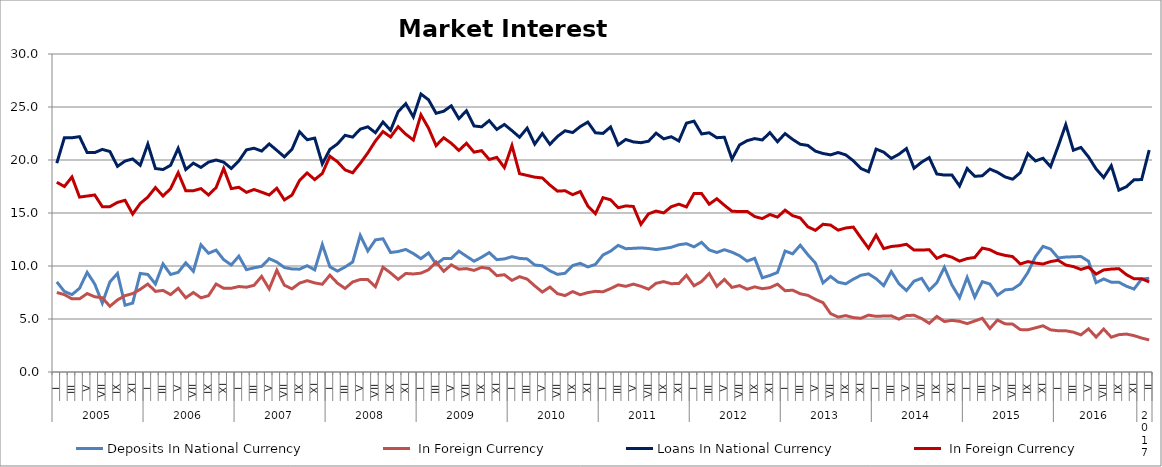
| Category | Deposits | Loans |
|---|---|---|
| 0 | 7.5 | 17.9 |
| 1 | 7.3 | 17.5 |
| 2 | 6.9 | 18.4 |
| 3 | 6.9 | 16.5 |
| 4 | 7.4 | 16.6 |
| 5 | 7.1 | 16.7 |
| 6 | 7 | 15.6 |
| 7 | 6.2 | 15.6 |
| 8 | 6.8 | 16 |
| 9 | 7.2 | 16.2 |
| 10 | 7.4 | 14.9 |
| 11 | 7.8 | 15.9 |
| 12 | 8.3 | 16.5 |
| 13 | 7.6 | 17.4 |
| 14 | 7.7 | 16.6 |
| 15 | 7.3 | 17.3 |
| 16 | 7.9 | 18.8 |
| 17 | 7 | 17.1 |
| 18 | 7.5 | 17.1 |
| 19 | 7 | 17.3 |
| 20 | 7.2 | 16.7 |
| 21 | 8.3 | 17.4 |
| 22 | 7.9 | 19.2 |
| 23 | 7.9 | 17.3 |
| 24 | 8.065 | 17.427 |
| 25 | 8 | 16.948 |
| 26 | 8.178 | 17.216 |
| 27 | 9.017 | 16.966 |
| 28 | 7.838 | 16.698 |
| 29 | 9.598 | 17.334 |
| 30 | 8.187 | 16.239 |
| 31 | 7.847 | 16.691 |
| 32 | 8.383 | 18.071 |
| 33 | 8.618 | 18.776 |
| 34 | 8.405 | 18.149 |
| 35 | 8.277 | 18.735 |
| 36 | 9.137 | 20.354 |
| 37 | 8.38 | 19.831 |
| 38 | 7.883 | 19.065 |
| 39 | 8.496 | 18.793 |
| 40 | 8.724 | 19.686 |
| 41 | 8.718 | 20.674 |
| 42 | 8.041 | 21.792 |
| 43 | 9.883 | 22.683 |
| 44 | 9.345 | 22.171 |
| 45 | 8.74 | 23.151 |
| 46 | 9.296 | 22.44 |
| 47 | 9.249 | 21.881 |
| 48 | 9.327 | 24.264 |
| 49 | 9.643 | 23.008 |
| 50 | 10.375 | 21.357 |
| 51 | 9.5 | 22.1 |
| 52 | 10.112 | 21.579 |
| 53 | 9.7 | 20.9 |
| 54 | 9.755 | 21.577 |
| 55 | 9.586 | 20.738 |
| 56 | 9.871 | 20.882 |
| 57 | 9.763 | 20.05 |
| 58 | 9.091 | 20.248 |
| 59 | 9.175 | 19.284 |
| 60 | 8.643 | 21.363 |
| 61 | 8.997 | 18.71 |
| 62 | 8.763 | 18.548 |
| 63 | 8.129 | 18.381 |
| 64 | 7.542 | 18.308 |
| 65 | 8.016 | 17.639 |
| 66 | 7.391 | 17.062 |
| 67 | 7.21 | 17.1 |
| 68 | 7.587 | 16.729 |
| 69 | 7.286 | 17.025 |
| 70 | 7.492 | 15.659 |
| 71 | 7.61 | 14.933 |
| 72 | 7.567 | 16.448 |
| 73 | 7.87 | 16.245 |
| 74 | 8.222 | 15.495 |
| 75 | 8.08 | 15.667 |
| 76 | 8.291 | 15.619 |
| 77 | 8.087 | 13.934 |
| 78 | 7.811 | 14.92 |
| 79 | 8.37 | 15.184 |
| 80 | 8.526 | 15.009 |
| 81 | 8.33 | 15.595 |
| 82 | 8.356 | 15.834 |
| 83 | 9.122 | 15.574 |
| 84 | 8.134 | 16.848 |
| 85 | 8.538 | 16.83 |
| 86 | 9.292 | 15.829 |
| 87 | 8.074 | 16.345 |
| 88 | 8.733 | 15.733 |
| 89 | 7.982 | 15.168 |
| 90 | 8.15 | 15.137 |
| 91 | 7.811 | 15.15 |
| 92 | 8.033 | 14.665 |
| 93 | 7.859 | 14.472 |
| 94 | 7.958 | 14.858 |
| 95 | 8.289 | 14.612 |
| 96 | 7.668 | 15.267 |
| 97 | 7.721 | 14.749 |
| 98 | 7.38 | 14.533 |
| 99 | 7.234 | 13.698 |
| 100 | 6.856 | 13.365 |
| 101 | 6.545 | 13.936 |
| 102 | 5.508 | 13.862 |
| 103 | 5.179 | 13.383 |
| 104 | 5.319 | 13.588 |
| 105 | 5.132 | 13.67 |
| 106 | 5.067 | 12.658 |
| 107 | 5.368 | 11.674 |
| 108 | 5.25 | 12.906 |
| 109 | 5.279 | 11.641 |
| 110 | 5.297 | 11.841 |
| 111 | 4.985 | 11.909 |
| 112 | 5.325 | 12.051 |
| 113 | 5.352 | 11.504 |
| 114 | 5.047 | 11.499 |
| 115 | 4.596 | 11.543 |
| 116 | 5.244 | 10.726 |
| 117 | 4.762 | 11.036 |
| 118 | 4.869 | 10.828 |
| 119 | 4.779 | 10.462 |
| 120 | 4.569 | 10.7 |
| 121 | 4.811 | 10.805 |
| 122 | 5.066 | 11.691 |
| 123 | 4.1 | 11.535 |
| 124 | 4.907 | 11.178 |
| 125 | 4.545 | 11 |
| 126 | 4.517 | 10.889 |
| 127 | 4 | 10.188 |
| 128 | 3.981 | 10.416 |
| 129 | 4.164 | 10.276 |
| 130 | 4.358 | 10.188 |
| 131 | 3.977 | 10.418 |
| 132 | 3.892 | 10.543 |
| 133 | 3.89 | 10.092 |
| 134 | 3.757 | 9.946 |
| 135 | 3.505 | 9.677 |
| 136 | 4.071 | 9.899 |
| 137 | 3.296 | 9.237 |
| 138 | 4.052 | 9.631 |
| 139 | 3.28 | 9.709 |
| 140 | 3.523 | 9.747 |
| 141 | 3.578 | 9.18 |
| 142 | 3.431 | 8.793 |
| 143 | 3.202 | 8.797 |
| 144 | 3.022 | 8.494 |